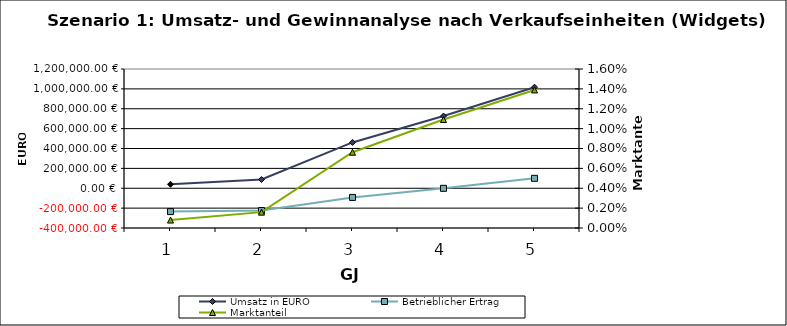
| Category | Umsatz in EURO | Betrieblicher Ertrag |
|---|---|---|
| 0 | 40000 | -235000 |
| 1 | 87852.791 | -224555.203 |
| 2 | 461227.153 | -92264.817 |
| 3 | 726432.767 | -769.462 |
| 4 | 1017005.873 | 100000 |